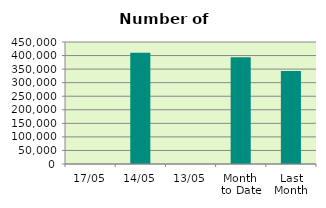
| Category | Series 0 |
|---|---|
| 17/05 | 2 |
| 14/05 | 410208 |
| 13/05 | 0 |
| Month 
to Date | 393730.4 |
| Last
Month | 343067.2 |